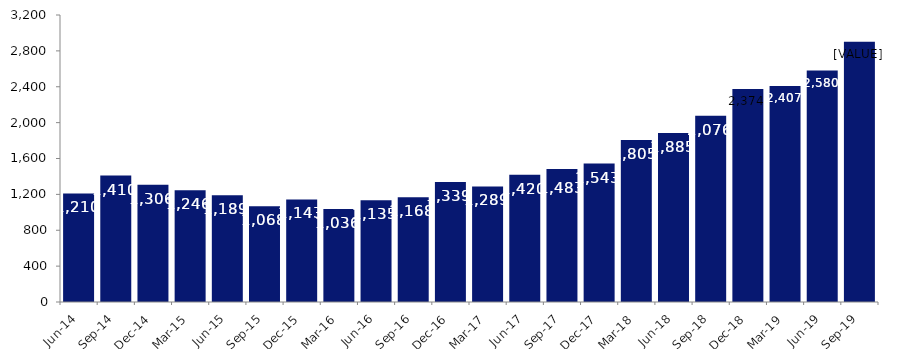
| Category | Series 0 |
|---|---|
| Jun-14 | 1210 |
| Sep-14 | 1410 |
| Dec-14 | 1306 |
| Mar-15 | 1246 |
| Jun-15 | 1189 |
| Sep-15 | 1068 |
| Dec-15 | 1143 |
| Mar-16 | 1036 |
| Jun-16 | 1135 |
| Sep-16 | 1168 |
| Dec-16 | 1339 |
| Mar-17 | 1289 |
| Jun-17 | 1420 |
| Sep-17 | 1483 |
| Dec-17 | 1543 |
| Mar-18 | 1805 |
| Jun-18 | 1885 |
| Sep-18 | 2076 |
| Dec-18 | 2374 |
| Mar-19 | 2407 |
| Jun-19 | 2580 |
| Sep-19 | 2901 |